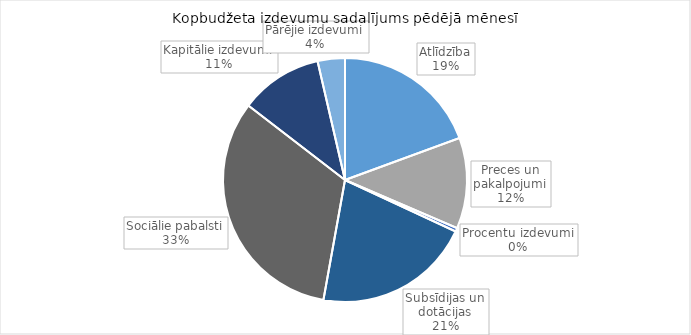
| Category | Series 0 |
|---|---|
| Atlīdzība | 214343.595 |
| Preces un pakalpojumi | 133134.712 |
| Procentu izdevumi | 5290.309 |
| Subsīdijas un dotācijas | 230895.582 |
| Sociālie pabalsti | 360252.873 |
| Kapitālie izdevumi | 120848.589 |
| Pārējie izdevumi | 39923.763 |